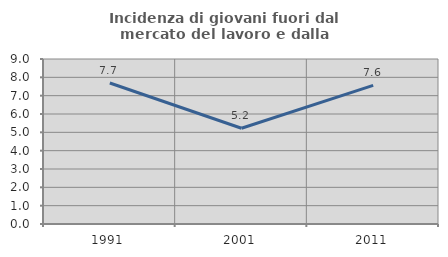
| Category | Incidenza di giovani fuori dal mercato del lavoro e dalla formazione  |
|---|---|
| 1991.0 | 7.692 |
| 2001.0 | 5.224 |
| 2011.0 | 7.563 |